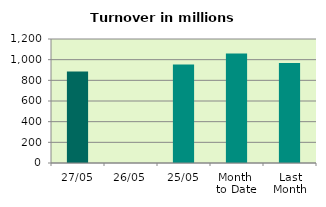
| Category | Series 0 |
|---|---|
| 27/05 | 886.046 |
| 26/05 | 0 |
| 25/05 | 952.708 |
| Month 
to Date | 1060.42 |
| Last
Month | 968.247 |